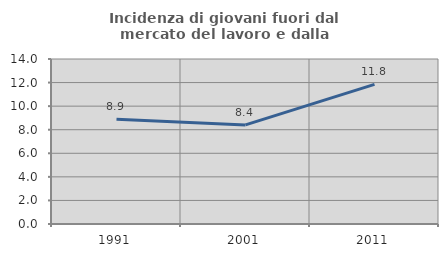
| Category | Incidenza di giovani fuori dal mercato del lavoro e dalla formazione  |
|---|---|
| 1991.0 | 8.889 |
| 2001.0 | 8.408 |
| 2011.0 | 11.846 |